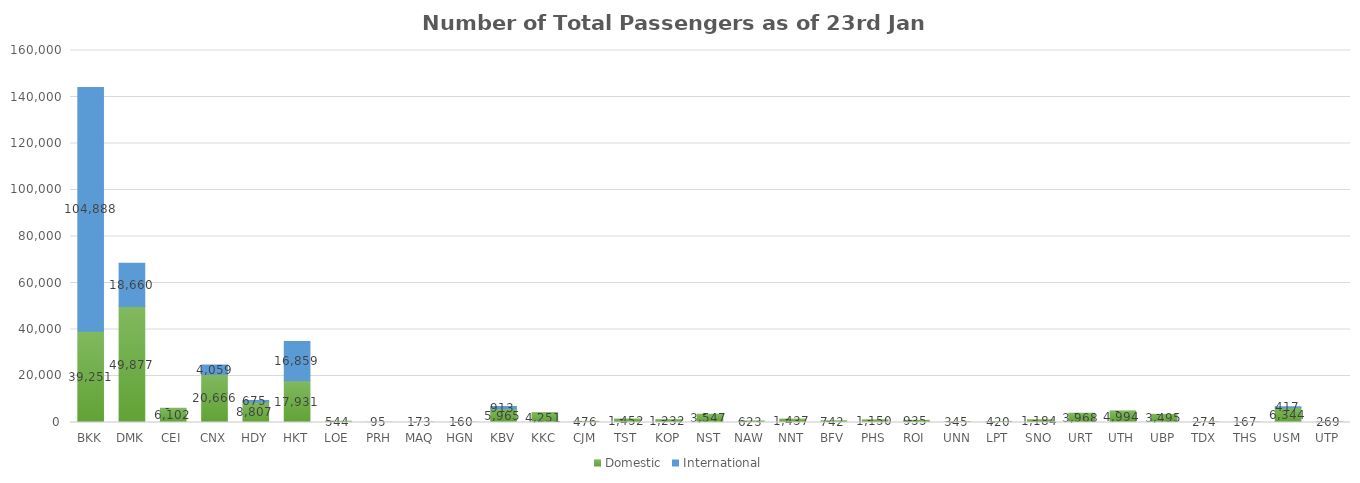
| Category | Domestic | International |
|---|---|---|
| BKK | 39251 | 104888 |
| DMK | 49877 | 18660 |
| CEI | 6102 | 0 |
| CNX | 20666 | 4059 |
| HDY | 8807 | 675 |
| HKT | 17931 | 16859 |
| LOE | 544 | 0 |
| PRH | 95 | 0 |
| MAQ | 173 | 0 |
| HGN | 160 | 0 |
| KBV | 5965 | 913 |
| KKC | 4251 | 0 |
| CJM | 476 | 0 |
| TST | 1452 | 0 |
| KOP | 1232 | 0 |
| NST | 3547 | 0 |
| NAW | 623 | 0 |
| NNT | 1437 | 0 |
| BFV | 742 | 0 |
| PHS | 1150 | 0 |
| ROI | 935 | 0 |
| UNN | 345 | 0 |
| LPT | 420 | 0 |
| SNO | 1184 | 0 |
| URT | 3968 | 0 |
| UTH | 4994 | 0 |
| UBP | 3495 | 0 |
| TDX | 274 | 0 |
| THS | 167 | 0 |
| USM | 6344 | 417 |
| UTP | 269 | 0 |